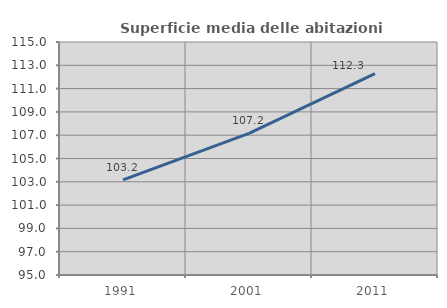
| Category | Superficie media delle abitazioni occupate |
|---|---|
| 1991.0 | 103.16 |
| 2001.0 | 107.156 |
| 2011.0 | 112.292 |